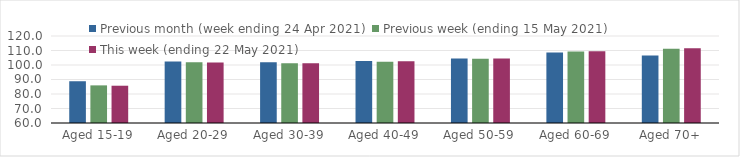
| Category | Previous month (week ending 24 Apr 2021) | Previous week (ending 15 May 2021) | This week (ending 22 May 2021) |
|---|---|---|---|
| Aged 15-19 | 88.8 | 85.95 | 85.71 |
| Aged 20-29 | 102.42 | 101.97 | 101.64 |
| Aged 30-39 | 101.86 | 101.25 | 101.26 |
| Aged 40-49 | 102.68 | 102.17 | 102.57 |
| Aged 50-59 | 104.5 | 104.23 | 104.56 |
| Aged 60-69 | 108.69 | 109.29 | 109.42 |
| Aged 70+ | 106.47 | 111.29 | 111.6 |